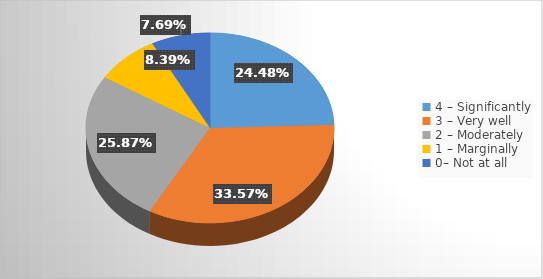
| Category | Series 0 |
|---|---|
| 4 – Significantly  | 0.245 |
| 3 – Very well  | 0.336 |
| 2 – Moderately  | 0.259 |
| 1 – Marginally  | 0.084 |
| 0– Not at all | 0.077 |